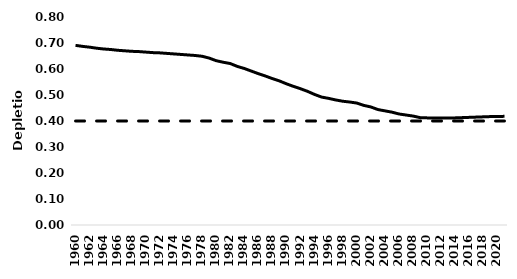
| Category | Depletion | Bmsy |
|---|---|---|
| 1960.0 | 0.691 | 0.4 |
| 1961.0 | 0.687 | 0.4 |
| 1962.0 | 0.684 | 0.4 |
| 1963.0 | 0.68 | 0.4 |
| 1964.0 | 0.677 | 0.4 |
| 1965.0 | 0.675 | 0.4 |
| 1966.0 | 0.672 | 0.4 |
| 1967.0 | 0.67 | 0.4 |
| 1968.0 | 0.668 | 0.4 |
| 1969.0 | 0.667 | 0.4 |
| 1970.0 | 0.665 | 0.4 |
| 1971.0 | 0.663 | 0.4 |
| 1972.0 | 0.662 | 0.4 |
| 1973.0 | 0.66 | 0.4 |
| 1974.0 | 0.658 | 0.4 |
| 1975.0 | 0.656 | 0.4 |
| 1976.0 | 0.654 | 0.4 |
| 1977.0 | 0.652 | 0.4 |
| 1978.0 | 0.649 | 0.4 |
| 1979.0 | 0.642 | 0.4 |
| 1980.0 | 0.632 | 0.4 |
| 1981.0 | 0.626 | 0.4 |
| 1982.0 | 0.621 | 0.4 |
| 1983.0 | 0.61 | 0.4 |
| 1984.0 | 0.602 | 0.4 |
| 1985.0 | 0.592 | 0.4 |
| 1986.0 | 0.582 | 0.4 |
| 1987.0 | 0.573 | 0.4 |
| 1988.0 | 0.563 | 0.4 |
| 1989.0 | 0.554 | 0.4 |
| 1990.0 | 0.543 | 0.4 |
| 1991.0 | 0.533 | 0.4 |
| 1992.0 | 0.524 | 0.4 |
| 1993.0 | 0.514 | 0.4 |
| 1994.0 | 0.502 | 0.4 |
| 1995.0 | 0.492 | 0.4 |
| 1996.0 | 0.487 | 0.4 |
| 1997.0 | 0.481 | 0.4 |
| 1998.0 | 0.476 | 0.4 |
| 1999.0 | 0.473 | 0.4 |
| 2000.0 | 0.469 | 0.4 |
| 2001.0 | 0.46 | 0.4 |
| 2002.0 | 0.454 | 0.4 |
| 2003.0 | 0.444 | 0.4 |
| 2004.0 | 0.439 | 0.4 |
| 2005.0 | 0.434 | 0.4 |
| 2006.0 | 0.427 | 0.4 |
| 2007.0 | 0.423 | 0.4 |
| 2008.0 | 0.419 | 0.4 |
| 2009.0 | 0.413 | 0.4 |
| 2010.0 | 0.412 | 0.4 |
| 2011.0 | 0.412 | 0.4 |
| 2012.0 | 0.412 | 0.4 |
| 2013.0 | 0.412 | 0.4 |
| 2014.0 | 0.412 | 0.4 |
| 2015.0 | 0.413 | 0.4 |
| 2016.0 | 0.414 | 0.4 |
| 2017.0 | 0.415 | 0.4 |
| 2018.0 | 0.416 | 0.4 |
| 2019.0 | 0.417 | 0.4 |
| 2020.0 | 0.417 | 0.4 |
| 2021.0 | 0.418 | 0.4 |